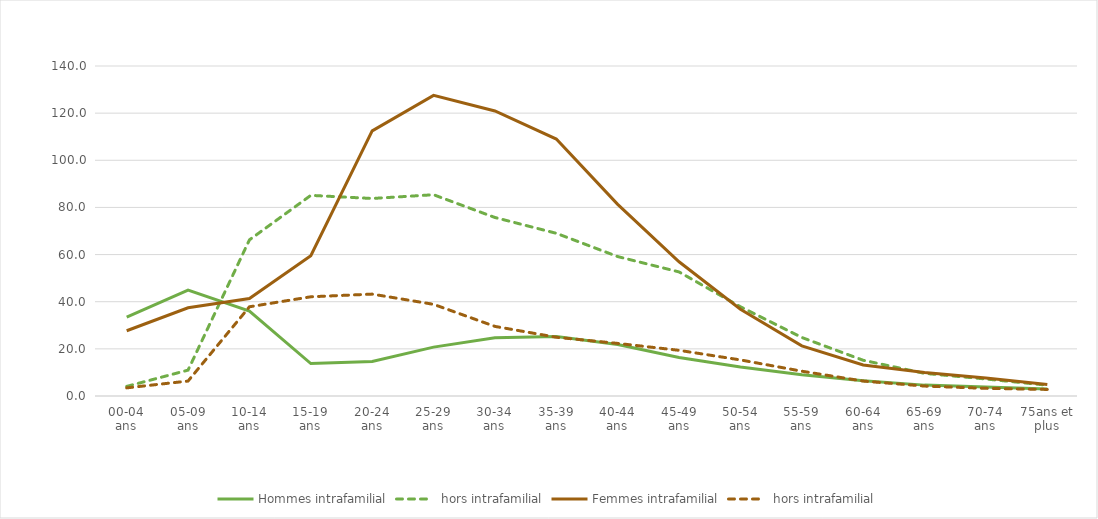
| Category | Hommes | Femmes |
|---|---|---|
| 00-04 ans | 4.072 | 3.446 |
| 05-09 ans | 10.971 | 6.343 |
| 10-14 ans | 66.238 | 37.854 |
| 15-19 ans | 85.118 | 42.089 |
| 20-24 ans | 83.795 | 43.229 |
| 25-29 ans | 85.381 | 38.884 |
| 30-34 ans | 75.733 | 29.527 |
| 35-39 ans | 69.022 | 24.921 |
| 40-44 ans | 59.154 | 22.315 |
| 45-49 ans | 52.641 | 19.374 |
| 50-54 ans | 37.856 | 15.307 |
| 55-59 ans | 24.83 | 10.521 |
| 60-64 ans | 15.16 | 6.332 |
| 65-69 ans | 9.602 | 4.207 |
| 70-74 ans | 7.21 | 3.242 |
| 75ans et plus | 4.576 | 2.786 |